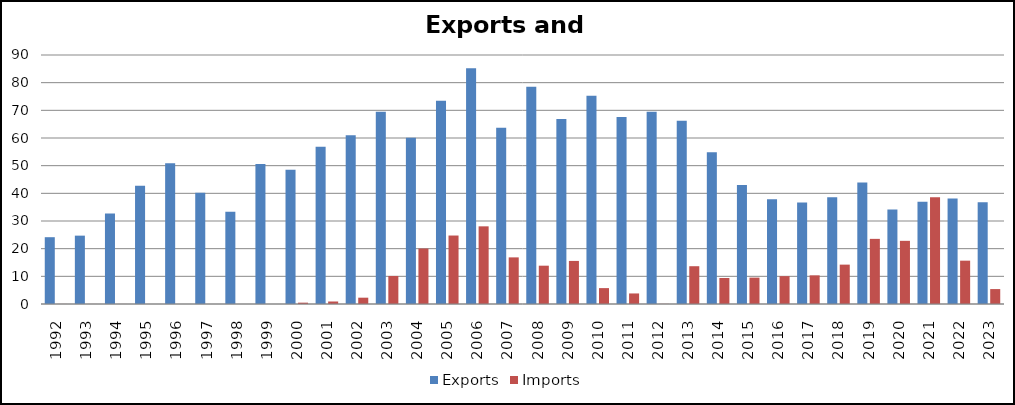
| Category | Exports | Imports |
|---|---|---|
| 1992.0 | 24.146 | 0.02 |
| 1993.0 | 24.708 | 0.015 |
| 1994.0 | 32.738 | 0.013 |
| 1995.0 | 42.707 | 0.003 |
| 1996.0 | 50.898 | 0.002 |
| 1997.0 | 40.203 | 0.001 |
| 1998.0 | 33.327 | 0.002 |
| 1999.0 | 50.618 | 0.001 |
| 2000.0 | 48.484 | 0.484 |
| 2001.0 | 56.854 | 0.905 |
| 2002.0 | 61.022 | 2.283 |
| 2003.0 | 69.462 | 10.134 |
| 2004.0 | 60.132 | 20.056 |
| 2005.0 | 73.451 | 24.75 |
| 2006.0 | 85.237 | 28.071 |
| 2007.0 | 63.672 | 16.852 |
| 2008.0 | 78.51 | 13.848 |
| 2009.0 | 66.912 | 15.568 |
| 2010.0 | 75.263 | 5.744 |
| 2011.0 | 67.576 | 3.812 |
| 2012.0 | 69.505 | 0.043 |
| 2013.0 | 66.235 | 13.659 |
| 2014.0 | 54.882 | 9.396 |
| 2015.0 | 43.048 | 9.534 |
| 2016.0 | 37.841 | 10.07 |
| 2017.0 | 36.69 | 10.356 |
| 2018.0 | 38.572 | 14.232 |
| 2019.0 | 43.914 | 23.543 |
| 2020.0 | 34.126 | 22.829 |
| 2021.0 | 36.947 | 38.562 |
| 2022.0 | 38.153 | 15.664 |
| 2023.0 | 36.743 | 5.394 |